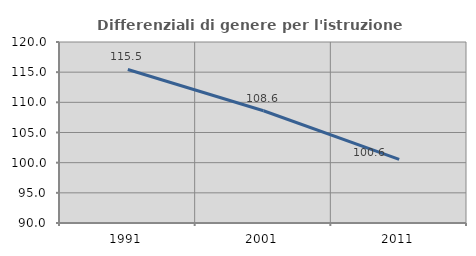
| Category | Differenziali di genere per l'istruzione superiore |
|---|---|
| 1991.0 | 115.451 |
| 2001.0 | 108.606 |
| 2011.0 | 100.551 |